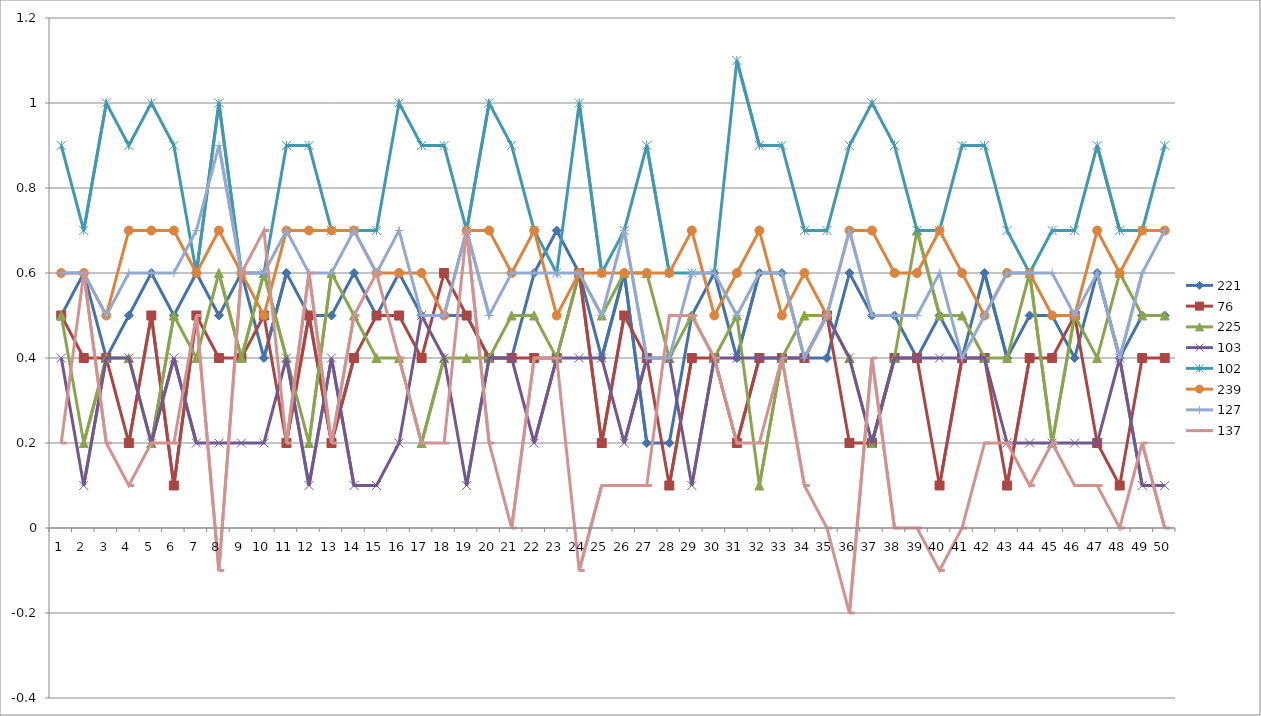
| Category | 221 | 76 | 225 | 103 | 102 | 239 | 127 | 137 |
|---|---|---|---|---|---|---|---|---|
| 0 | 0.5 | 0.5 | 0.5 | 0.4 | 0.9 | 0.6 | 0.6 | 0.2 |
| 1 | 0.6 | 0.4 | 0.2 | 0.1 | 0.7 | 0.6 | 0.6 | 0.6 |
| 2 | 0.4 | 0.4 | 0.4 | 0.4 | 1 | 0.5 | 0.5 | 0.2 |
| 3 | 0.5 | 0.2 | 0.4 | 0.4 | 0.9 | 0.7 | 0.6 | 0.1 |
| 4 | 0.6 | 0.5 | 0.2 | 0.2 | 1 | 0.7 | 0.6 | 0.2 |
| 5 | 0.5 | 0.1 | 0.5 | 0.4 | 0.9 | 0.7 | 0.6 | 0.2 |
| 6 | 0.6 | 0.5 | 0.4 | 0.2 | 0.6 | 0.6 | 0.7 | 0.5 |
| 7 | 0.5 | 0.4 | 0.6 | 0.2 | 1 | 0.7 | 0.9 | -0.1 |
| 8 | 0.6 | 0.4 | 0.4 | 0.2 | 0.6 | 0.6 | 0.6 | 0.6 |
| 9 | 0.4 | 0.5 | 0.6 | 0.2 | 0.6 | 0.5 | 0.6 | 0.7 |
| 10 | 0.6 | 0.2 | 0.4 | 0.4 | 0.9 | 0.7 | 0.7 | 0.2 |
| 11 | 0.5 | 0.5 | 0.2 | 0.1 | 0.9 | 0.7 | 0.6 | 0.6 |
| 12 | 0.5 | 0.2 | 0.6 | 0.4 | 0.7 | 0.7 | 0.6 | 0.2 |
| 13 | 0.6 | 0.4 | 0.5 | 0.1 | 0.7 | 0.7 | 0.7 | 0.5 |
| 14 | 0.5 | 0.5 | 0.4 | 0.1 | 0.7 | 0.6 | 0.6 | 0.6 |
| 15 | 0.6 | 0.5 | 0.4 | 0.2 | 1 | 0.6 | 0.7 | 0.4 |
| 16 | 0.5 | 0.4 | 0.2 | 0.5 | 0.9 | 0.6 | 0.5 | 0.2 |
| 17 | 0.5 | 0.6 | 0.4 | 0.4 | 0.9 | 0.5 | 0.5 | 0.2 |
| 18 | 0.5 | 0.5 | 0.4 | 0.1 | 0.7 | 0.7 | 0.7 | 0.7 |
| 19 | 0.4 | 0.4 | 0.4 | 0.4 | 1 | 0.7 | 0.5 | 0.2 |
| 20 | 0.4 | 0.4 | 0.5 | 0.4 | 0.9 | 0.6 | 0.6 | 0 |
| 21 | 0.6 | 0.4 | 0.5 | 0.2 | 0.7 | 0.7 | 0.6 | 0.4 |
| 22 | 0.7 | 0.4 | 0.4 | 0.4 | 0.6 | 0.5 | 0.6 | 0.4 |
| 23 | 0.6 | 0.6 | 0.6 | 0.4 | 1 | 0.6 | 0.6 | -0.1 |
| 24 | 0.4 | 0.2 | 0.5 | 0.4 | 0.6 | 0.6 | 0.5 | 0.1 |
| 25 | 0.6 | 0.5 | 0.6 | 0.2 | 0.7 | 0.6 | 0.7 | 0.1 |
| 26 | 0.2 | 0.4 | 0.6 | 0.4 | 0.9 | 0.6 | 0.4 | 0.1 |
| 27 | 0.2 | 0.1 | 0.4 | 0.4 | 0.6 | 0.6 | 0.4 | 0.5 |
| 28 | 0.5 | 0.4 | 0.5 | 0.1 | 0.6 | 0.7 | 0.6 | 0.5 |
| 29 | 0.6 | 0.4 | 0.4 | 0.4 | 0.6 | 0.5 | 0.6 | 0.4 |
| 30 | 0.4 | 0.2 | 0.5 | 0.4 | 1.1 | 0.6 | 0.5 | 0.2 |
| 31 | 0.6 | 0.4 | 0.1 | 0.4 | 0.9 | 0.7 | 0.6 | 0.2 |
| 32 | 0.6 | 0.4 | 0.4 | 0.4 | 0.9 | 0.5 | 0.6 | 0.4 |
| 33 | 0.4 | 0.4 | 0.5 | 0.4 | 0.7 | 0.6 | 0.4 | 0.1 |
| 34 | 0.4 | 0.5 | 0.5 | 0.5 | 0.7 | 0.5 | 0.5 | 0 |
| 35 | 0.6 | 0.2 | 0.4 | 0.4 | 0.9 | 0.7 | 0.7 | -0.2 |
| 36 | 0.5 | 0.2 | 0.2 | 0.2 | 1 | 0.7 | 0.5 | 0.4 |
| 37 | 0.5 | 0.4 | 0.4 | 0.4 | 0.9 | 0.6 | 0.5 | 0 |
| 38 | 0.4 | 0.4 | 0.7 | 0.4 | 0.7 | 0.6 | 0.5 | 0 |
| 39 | 0.5 | 0.1 | 0.5 | 0.4 | 0.7 | 0.7 | 0.6 | -0.1 |
| 40 | 0.4 | 0.4 | 0.5 | 0.4 | 0.9 | 0.6 | 0.4 | 0 |
| 41 | 0.6 | 0.4 | 0.4 | 0.4 | 0.9 | 0.5 | 0.5 | 0.2 |
| 42 | 0.4 | 0.1 | 0.4 | 0.2 | 0.7 | 0.6 | 0.6 | 0.2 |
| 43 | 0.5 | 0.4 | 0.6 | 0.2 | 0.6 | 0.6 | 0.6 | 0.1 |
| 44 | 0.5 | 0.4 | 0.2 | 0.2 | 0.7 | 0.5 | 0.6 | 0.2 |
| 45 | 0.4 | 0.5 | 0.5 | 0.2 | 0.7 | 0.5 | 0.5 | 0.1 |
| 46 | 0.6 | 0.2 | 0.4 | 0.2 | 0.9 | 0.7 | 0.6 | 0.1 |
| 47 | 0.4 | 0.1 | 0.6 | 0.4 | 0.7 | 0.6 | 0.4 | 0 |
| 48 | 0.5 | 0.4 | 0.5 | 0.1 | 0.7 | 0.7 | 0.6 | 0.2 |
| 49 | 0.5 | 0.4 | 0.5 | 0.1 | 0.9 | 0.7 | 0.7 | 0 |